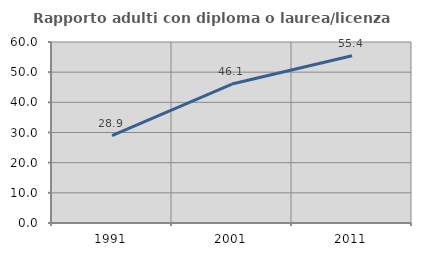
| Category | Rapporto adulti con diploma o laurea/licenza media  |
|---|---|
| 1991.0 | 28.926 |
| 2001.0 | 46.06 |
| 2011.0 | 55.448 |